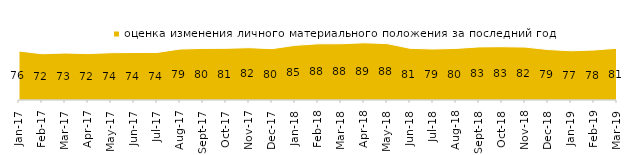
| Category | оценка изменения личного материального положения за последний год |
|---|---|
| 2017-01-01 | 76.3 |
| 2017-02-01 | 72.1 |
| 2017-03-01 | 73.2 |
| 2017-04-01 | 72.3 |
| 2017-05-01 | 73.7 |
| 2017-06-01 | 74.05 |
| 2017-07-01 | 74.1 |
| 2017-08-01 | 79.4 |
| 2017-09-01 | 80.4 |
| 2017-10-01 | 80.55 |
| 2017-11-01 | 81.55 |
| 2017-12-01 | 80 |
| 2018-01-01 | 85.15 |
| 2018-02-01 | 87.55 |
| 2018-03-01 | 87.65 |
| 2018-04-01 | 89.15 |
| 2018-05-01 | 87.9 |
| 2018-06-01 | 80.55 |
| 2018-07-01 | 79.45 |
| 2018-08-01 | 80.4 |
| 2018-09-01 | 82.75 |
| 2018-10-01 | 83.05 |
| 2018-11-01 | 82.485 |
| 2018-12-01 | 78.65 |
| 2019-01-01 | 76.7 |
| 2019-02-01 | 77.9 |
| 2019-03-01 | 80.656 |